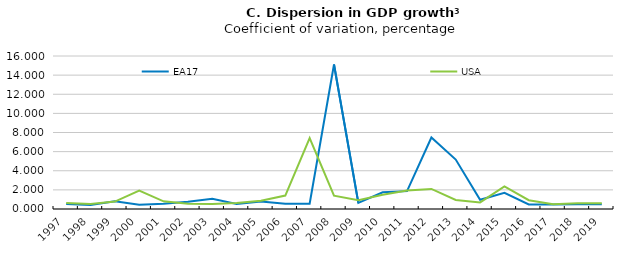
| Category | EA17 | USA |
|---|---|---|
| 1997.0 | 0.535 | 0.632 |
| 1998.0 | 0.424 | 0.526 |
| 1999.0 | 0.819 | 0.777 |
| 2000.0 | 0.445 | 1.918 |
| 2001.0 | 0.557 | 0.803 |
| 2002.0 | 0.758 | 0.55 |
| 2003.0 | 1.071 | 0.528 |
| 2004.0 | 0.523 | 0.615 |
| 2005.0 | 0.774 | 0.862 |
| 2006.0 | 0.543 | 1.402 |
| 2007.0 | 0.551 | 7.411 |
| 2008.0 | 15.111 | 1.394 |
| 2009.0 | 0.636 | 0.923 |
| 2010.0 | 1.751 | 1.485 |
| 2011.0 | 1.868 | 1.942 |
| 2012.0 | 7.477 | 2.097 |
| 2013.0 | 5.166 | 0.94 |
| 2014.0 | 0.967 | 0.693 |
| 2015.0 | 1.685 | 2.367 |
| 2016.0 | 0.478 | 0.923 |
| 2017.0 | 0.46 | 0.504 |
| 2018.0 | 0.507 | 0.597 |
| 2019.0 | 0.491 | 0.597 |